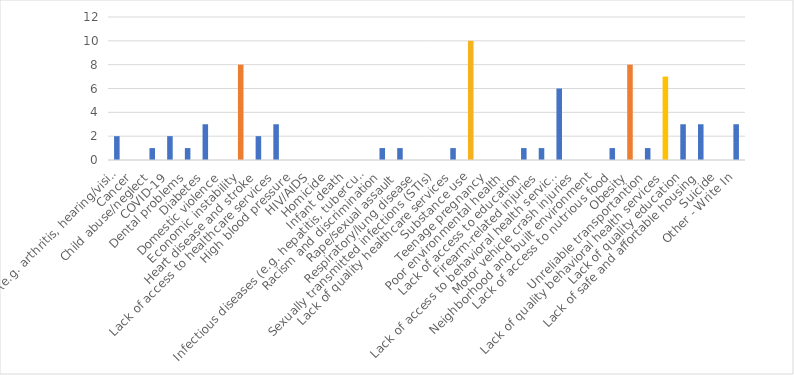
| Category | Number of Responses |
|---|---|
| Aging problems (e.g. arthritis, hearing/vision loss, etc.) | 2 |
| Cancer | 0 |
| Child abuse/neglect | 1 |
| COVID-19 | 2 |
| Dental problems | 1 |
| Diabetes | 3 |
| Domestic violence | 0 |
| Economic instability | 8 |
| Heart disease and stroke | 2 |
| Lack of access to healthcare services | 3 |
| High blood pressure | 0 |
| HIV/AIDS | 0 |
| Homicide | 0 |
| Infant death | 0 |
| Infectious diseases (e.g. hepatitis, tuberculosis, etc.) | 0 |
| Racism and discrimination | 1 |
| Rape/sexual assault | 1 |
| Respiratory/lung disease | 0 |
| Sexually transmitted infections (STIs) | 0 |
| Lack of quality healthcare services | 1 |
| Substance use | 10 |
| Teenage pregnancy | 0 |
| Poor environmental health | 0 |
| Lack of access to education | 1 |
| Firearm-related injuries | 1 |
| Lack of access to behavioral health services | 6 |
| Motor vehicle crash injuries | 0 |
| Neighborhood and built environment | 0 |
| Lack of access to nutrious food | 1 |
| Obesity | 8 |
| Unreliable transportantion | 1 |
| Lack of quality behavioral health services | 7 |
| Lack of quality education | 3 |
| Lack of safe and affortable housing | 3 |
| Suicide | 0 |
| Other - Write In | 3 |